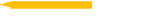
| Category | Difficult to implement at all levels simultaneously |
|---|---|
| Difficult to implement at all levels simultaneously | 3 |